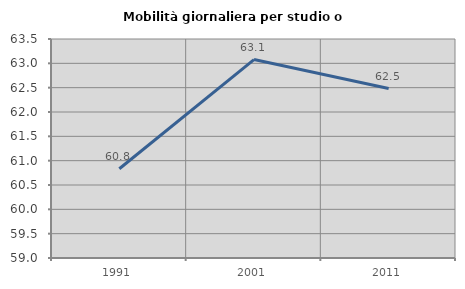
| Category | Mobilità giornaliera per studio o lavoro |
|---|---|
| 1991.0 | 60.834 |
| 2001.0 | 63.077 |
| 2011.0 | 62.481 |